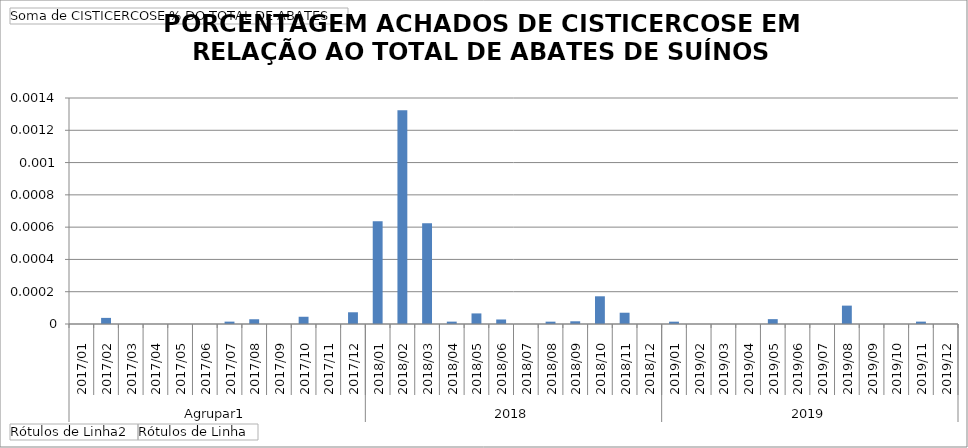
| Category | Total |
|---|---|
| 0 | 0 |
| 1 | 0 |
| 2 | 0 |
| 3 | 0 |
| 4 | 0 |
| 5 | 0 |
| 6 | 0 |
| 7 | 0 |
| 8 | 0 |
| 9 | 0 |
| 10 | 0 |
| 11 | 0 |
| 12 | 0.001 |
| 13 | 0.001 |
| 14 | 0.001 |
| 15 | 0 |
| 16 | 0 |
| 17 | 0 |
| 18 | 0 |
| 19 | 0 |
| 20 | 0 |
| 21 | 0 |
| 22 | 0 |
| 23 | 0 |
| 24 | 0 |
| 25 | 0 |
| 26 | 0 |
| 27 | 0 |
| 28 | 0 |
| 29 | 0 |
| 30 | 0 |
| 31 | 0 |
| 32 | 0 |
| 33 | 0 |
| 34 | 0 |
| 35 | 0 |